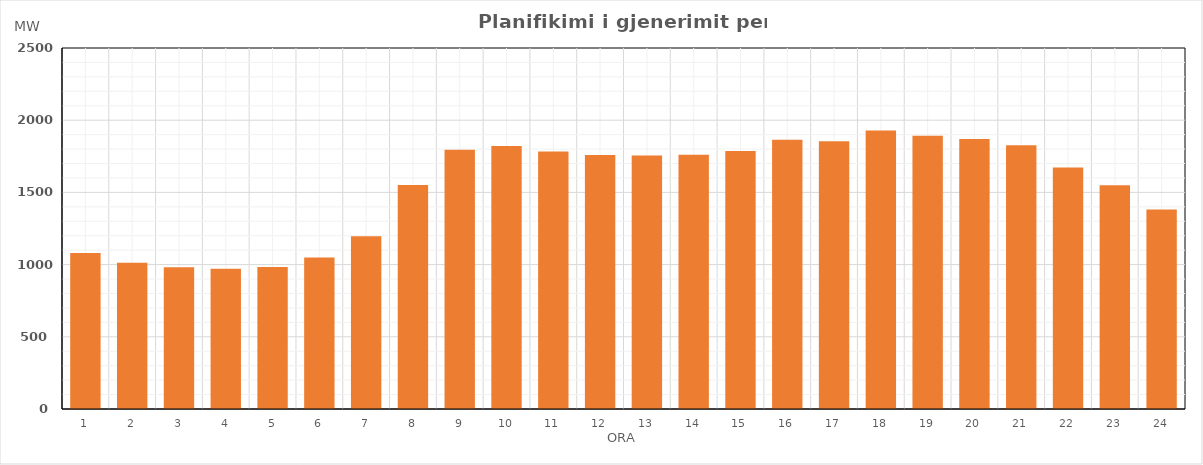
| Category | Max (MW) |
|---|---|
| 0 | 1080.06 |
| 1 | 1012.37 |
| 2 | 981.2 |
| 3 | 970.85 |
| 4 | 983.45 |
| 5 | 1049.68 |
| 6 | 1195.59 |
| 7 | 1551.42 |
| 8 | 1795.66 |
| 9 | 1822.07 |
| 10 | 1783.74 |
| 11 | 1758.54 |
| 12 | 1755.32 |
| 13 | 1760.2 |
| 14 | 1785.92 |
| 15 | 1864.27 |
| 16 | 1854.5 |
| 17 | 1927.94 |
| 18 | 1892.52 |
| 19 | 1869.91 |
| 20 | 1827.1 |
| 21 | 1672.52 |
| 22 | 1548.93 |
| 23 | 1380.87 |